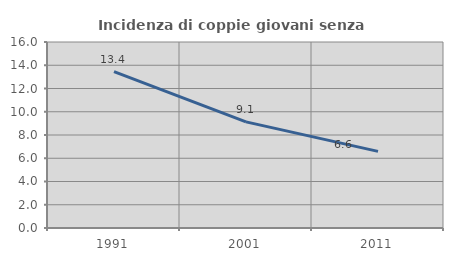
| Category | Incidenza di coppie giovani senza figli |
|---|---|
| 1991.0 | 13.446 |
| 2001.0 | 9.128 |
| 2011.0 | 6.591 |